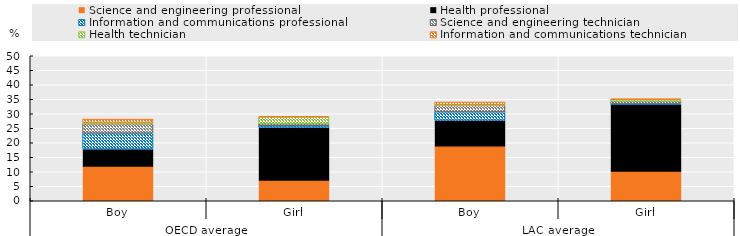
| Category | Science and engineering professional | Health professional | Information and communications professional | Science and engineering technician | Health technician | Information and communications technician |
|---|---|---|---|---|---|---|
| 0 | 12.183 | 5.655 | 5.45 | 3.199 | 0.514 | 1.153 |
| 1 | 7.366 | 17.892 | 0.601 | 0.665 | 2.375 | 0.171 |
| 2 | 19.136 | 8.629 | 2.875 | 2.215 | 0.308 | 0.883 |
| 3 | 10.393 | 22.716 | 0.381 | 0.854 | 0.632 | 0.123 |